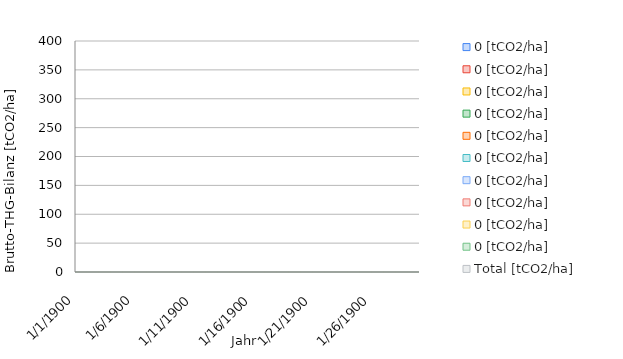
| Category | 0 [tCO2/ha] | Total [tCO2/ha] |
|---|---|---|
| 1.0 | 0 | 0 |
| 2.0 | 0 | 0 |
| 3.0 | 0 | 0 |
| 4.0 | 0 | 0 |
| 5.0 | 0 | 0 |
| 6.0 | 0 | 0 |
| 7.0 | 0 | 0 |
| 8.0 | 0 | 0 |
| 9.0 | 0 | 0 |
| 10.0 | 0 | 0 |
| 11.0 | 0 | 0 |
| 12.0 | 0 | 0 |
| 13.0 | 0 | 0 |
| 14.0 | 0 | 0 |
| 15.0 | 0 | 0 |
| 16.0 | 0 | 0 |
| 17.0 | 0 | 0 |
| 18.0 | 0 | 0 |
| 19.0 | 0 | 0 |
| 20.0 | 0 | 0 |
| 21.0 | 0 | 0 |
| 22.0 | 0 | 0 |
| 23.0 | 0 | 0 |
| 24.0 | 0 | 0 |
| 25.0 | 0 | 0 |
| 26.0 | 0 | 0 |
| 27.0 | 0 | 0 |
| 28.0 | 0 | 0 |
| 29.0 | 0 | 0 |
| 30.0 | 0 | 0 |